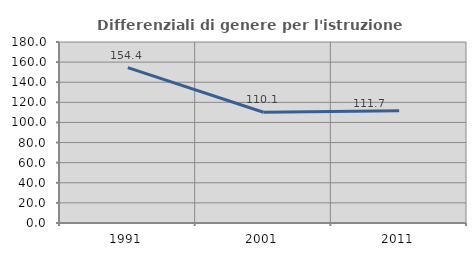
| Category | Differenziali di genere per l'istruzione superiore |
|---|---|
| 1991.0 | 154.447 |
| 2001.0 | 110.118 |
| 2011.0 | 111.717 |